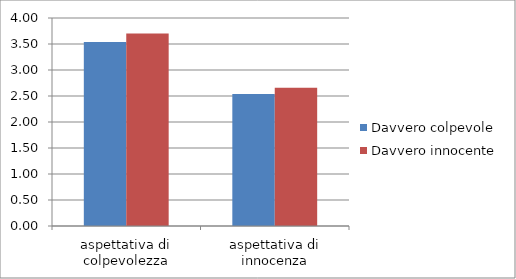
| Category | Davvero colpevole | Davvero innocente |
|---|---|---|
| aspettativa di colpevolezza | 3.54 | 3.7 |
| aspettativa di innocenza | 2.54 | 2.66 |